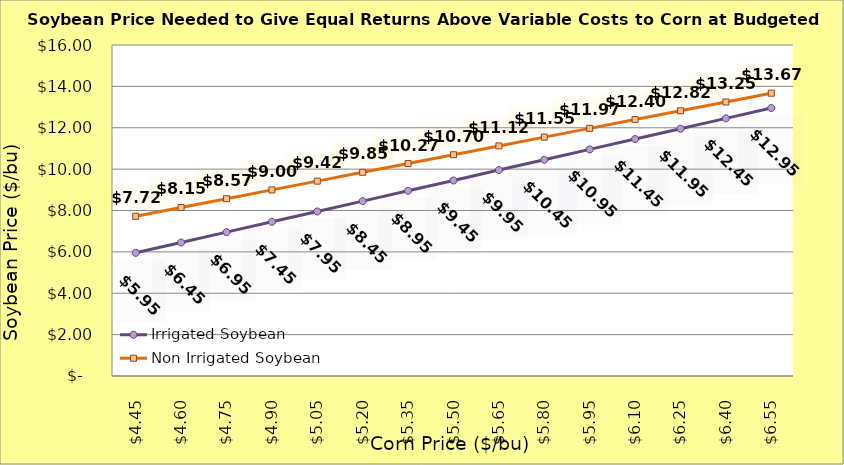
| Category | Irrigated Soybean | Non Irrigated Soybean |
|---|---|---|
| 4.4499999999999975 | 5.954 | 7.721 |
| 4.599999999999998 | 6.454 | 8.146 |
| 4.749999999999998 | 6.954 | 8.571 |
| 4.899999999999999 | 7.454 | 8.996 |
| 5.049999999999999 | 7.954 | 9.421 |
| 5.199999999999999 | 8.454 | 9.846 |
| 5.35 | 8.954 | 10.271 |
| 5.5 | 9.454 | 10.696 |
| 5.65 | 9.954 | 11.121 |
| 5.800000000000001 | 10.454 | 11.546 |
| 5.950000000000001 | 10.954 | 11.971 |
| 6.100000000000001 | 11.454 | 12.396 |
| 6.250000000000002 | 11.954 | 12.821 |
| 6.400000000000002 | 12.454 | 13.246 |
| 6.5500000000000025 | 12.954 | 13.671 |